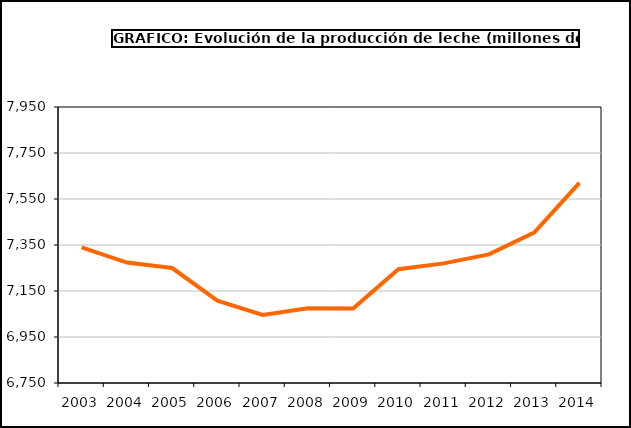
| Category | Total leche |
|---|---|
| 2003.0 | 7339.616 |
| 2004.0 | 7273.547 |
| 2005.0 | 7249.843 |
| 2006.0 | 7107.75 |
| 2007.0 | 7046.085 |
| 2008.0 | 7074.769 |
| 2009.0 | 7073.924 |
| 2010.0 | 7244.584 |
| 2011.0 | 7270 |
| 2012.0 | 7309.156 |
| 2013.0 | 7403.744 |
| 2014.0 | 7620.059 |